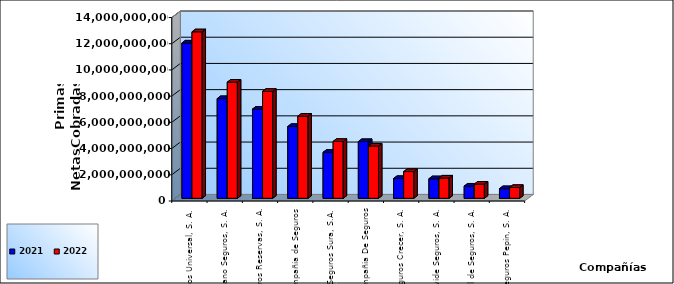
| Category | 2021 | 2022 |
|---|---|---|
| Seguros Universal, S. A. | 11849393182.02 | 12702863250.8 |
| Humano Seguros, S. A. | 7606975535.05 | 8863318460.88 |
| Seguros Reservas, S. A. | 6805201492.73 | 8161164346.18 |
| Mapfre BHD Compañía de Seguros | 5480998271.49 | 6264262959.94 |
| Seguros Sura, S.A. | 3508175119.96 | 4341717111.97 |
| La Colonial, S. A., Compañia De Seguros | 4328347275.3 | 3987655607.12 |
| Seguros Crecer, S. A. | 1511990738.85 | 2040822288.66 |
| Worldwide Seguros, S. A. | 1491314252.89 | 1546861054.83 |
| General de Seguros, S. A. | 932171743.99 | 1081815419.1 |
| Seguros Pepín, S. A. | 736189358.87 | 827782956.01 |